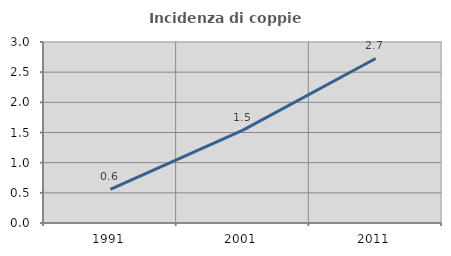
| Category | Incidenza di coppie miste |
|---|---|
| 1991.0 | 0.555 |
| 2001.0 | 1.538 |
| 2011.0 | 2.727 |